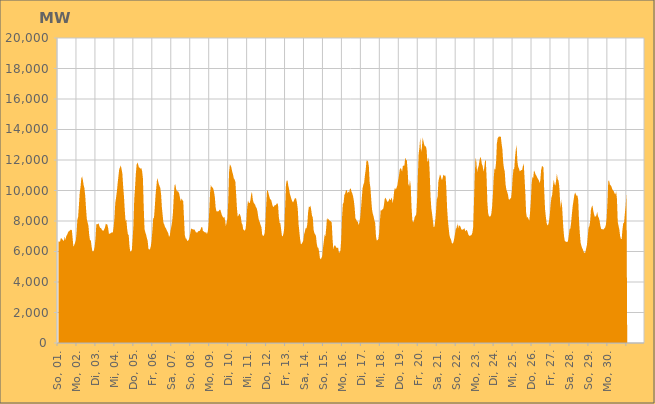
| Category | Series 0 |
|---|---|
|  So, 01.  | 6642.028 |
|  So, 01.  | 6674.191 |
|  So, 01.  | 6621.599 |
|  So, 01.  | 6863.994 |
|  So, 01.  | 6864.676 |
|  So, 01.  | 6793.633 |
|  So, 01.  | 6730.198 |
|  So, 01.  | 6692.56 |
|  So, 01.  | 6982.419 |
|  So, 01.  | 6750.493 |
|  So, 01.  | 7025.823 |
|  So, 01.  | 7081.991 |
|  So, 01.  | 7235.701 |
|  So, 01.  | 7320.651 |
|  So, 01.  | 7346.034 |
|  So, 01.  | 7436.463 |
|  So, 01.  | 7391.824 |
|  Mo, 02.  | 7438.178 |
|  Mo, 02.  | 6881.435 |
|  Mo, 02.  | 6318.565 |
|  Mo, 02.  | 6419.591 |
|  Mo, 02.  | 6559.201 |
|  Mo, 02.  | 6708.7 |
|  Mo, 02.  | 7224.834 |
|  Mo, 02.  | 8080.446 |
|  Mo, 02.  | 8278.272 |
|  Mo, 02.  | 9048.295 |
|  Mo, 02.  | 9866.225 |
|  Mo, 02.  | 10212.87 |
|  Mo, 02.  | 10788.285 |
|  Mo, 02.  | 10922.521 |
|  Mo, 02.  | 10682.266 |
|  Mo, 02.  | 10339.245 |
|  Mo, 02.  | 10139.451 |
|  Mo, 02.  | 9632.16 |
|  Mo, 02.  | 8816.503 |
|  Mo, 02.  | 8119.231 |
|  Mo, 02.  | 7904.268 |
|  Mo, 02.  | 7702.65 |
|  Mo, 02.  | 7088.664 |
|  Mo, 02.  | 6734.831 |
|  Di, 03.  | 6744.243 |
|  Di, 03.  | 6337.28 |
|  Di, 03.  | 6030.206 |
|  Di, 03.  | 5993.294 |
|  Di, 03.  | 6095.118 |
|  Di, 03.  | 6337.548 |
|  Di, 03.  | 6871.834 |
|  Di, 03.  | 7782.233 |
|  Di, 03.  | 7782.221 |
|  Di, 03.  | 7811.911 |
|  Di, 03.  | 7843.748 |
|  Di, 03.  | 7639.849 |
|  Di, 03.  | 7547.561 |
|  Di, 03.  | 7541.524 |
|  Di, 03.  | 7431.637 |
|  Di, 03.  | 7373.073 |
|  Di, 03.  | 7352.578 |
|  Di, 03.  | 7453.121 |
|  Di, 03.  | 7579.167 |
|  Di, 03.  | 7813.836 |
|  Di, 03.  | 7795.705 |
|  Di, 03.  | 7748.932 |
|  Di, 03.  | 7537.983 |
|  Di, 03.  | 7145.782 |
|  Mi, 04.  | 7179.503 |
|  Mi, 04.  | 7193.008 |
|  Mi, 04.  | 7255.267 |
|  Mi, 04.  | 7226.2 |
|  Mi, 04.  | 7283.433 |
|  Mi, 04.  | 7632.698 |
|  Mi, 04.  | 8220.909 |
|  Mi, 04.  | 9187.249 |
|  Mi, 04.  | 9527.014 |
|  Mi, 04.  | 9926.317 |
|  Mi, 04.  | 10467.25 |
|  Mi, 04.  | 10930.109 |
|  Mi, 04.  | 11396.854 |
|  Mi, 04.  | 11509.429 |
|  Mi, 04.  | 11646.825 |
|  Mi, 04.  | 11391.69 |
|  Mi, 04.  | 11098.729 |
|  Mi, 04.  | 10251.658 |
|  Mi, 04.  | 9624.944 |
|  Mi, 04.  | 8709.934 |
|  Mi, 04.  | 7988.747 |
|  Mi, 04.  | 8089.505 |
|  Mi, 04.  | 7493.998 |
|  Mi, 04.  | 7126.262 |
|  Do, 05.  | 7068.576 |
|  Do, 05.  | 6334.545 |
|  Do, 05.  | 5980.791 |
|  Do, 05.  | 6009.791 |
|  Do, 05.  | 6119.631 |
|  Do, 05.  | 6858.394 |
|  Do, 05.  | 7718.454 |
|  Do, 05.  | 9431.919 |
|  Do, 05.  | 10170.524 |
|  Do, 05.  | 11087.446 |
|  Do, 05.  | 11677.397 |
|  Do, 05.  | 11846.221 |
|  Do, 05.  | 11701.938 |
|  Do, 05.  | 11504.531 |
|  Do, 05.  | 11496.591 |
|  Do, 05.  | 11417.237 |
|  Do, 05.  | 11469.203 |
|  Do, 05.  | 11258.321 |
|  Do, 05.  | 10792.783 |
|  Do, 05.  | 8941.93 |
|  Do, 05.  | 7467.128 |
|  Do, 05.  | 7261.39 |
|  Do, 05.  | 7107.223 |
|  Do, 05.  | 6884.12 |
|  Fr, 06.  | 6700.08 |
|  Fr, 06.  | 6165.956 |
|  Fr, 06.  | 6123.522 |
|  Fr, 06.  | 6158.351 |
|  Fr, 06.  | 6351.654 |
|  Fr, 06.  | 6724.755 |
|  Fr, 06.  | 7395.35 |
|  Fr, 06.  | 8162.51 |
|  Fr, 06.  | 8220.292 |
|  Fr, 06.  | 8890.242 |
|  Fr, 06.  | 9718.031 |
|  Fr, 06.  | 10260.719 |
|  Fr, 06.  | 10804.893 |
|  Fr, 06.  | 10663.921 |
|  Fr, 06.  | 10439.058 |
|  Fr, 06.  | 10294.328 |
|  Fr, 06.  | 10161.905 |
|  Fr, 06.  | 9731.773 |
|  Fr, 06.  | 8898.601 |
|  Fr, 06.  | 8365.291 |
|  Fr, 06.  | 7872.196 |
|  Fr, 06.  | 7773.041 |
|  Fr, 06.  | 7602.123 |
|  Fr, 06.  | 7536.495 |
|  Sa, 07.  | 7415.241 |
|  Sa, 07.  | 7312.704 |
|  Sa, 07.  | 7208.53 |
|  Sa, 07.  | 6962.411 |
|  Sa, 07.  | 7035.768 |
|  Sa, 07.  | 7400.317 |
|  Sa, 07.  | 7646.554 |
|  Sa, 07.  | 7967.56 |
|  Sa, 07.  | 8543.211 |
|  Sa, 07.  | 9577.379 |
|  Sa, 07.  | 10330.854 |
|  Sa, 07.  | 10418.47 |
|  Sa, 07.  | 10094.211 |
|  Sa, 07.  | 9954.649 |
|  Sa, 07.  | 9957.218 |
|  Sa, 07.  | 9905.518 |
|  Sa, 07.  | 9772.035 |
|  Sa, 07.  | 9488.952 |
|  Sa, 07.  | 9302.322 |
|  Sa, 07.  | 9481.93 |
|  Sa, 07.  | 9362.161 |
|  Sa, 07.  | 9303.883 |
|  Sa, 07.  | 8175.89 |
|  Sa, 07.  | 7093.512 |
|  So, 08.  | 6864.181 |
|  So, 08.  | 6842.945 |
|  So, 08.  | 6699.577 |
|  So, 08.  | 6702.851 |
|  So, 08.  | 6769.923 |
|  So, 08.  | 6929.743 |
|  So, 08.  | 7227.672 |
|  So, 08.  | 7506.556 |
|  So, 08.  | 7474.205 |
|  So, 08.  | 7458.443 |
|  So, 08.  | 7441.474 |
|  So, 08.  | 7450.766 |
|  So, 08.  | 7375.902 |
|  So, 08.  | 7260.24 |
|  So, 08.  | 7243.029 |
|  So, 08.  | 7250.823 |
|  So, 08.  | 7330.732 |
|  So, 08.  | 7339.213 |
|  So, 08.  | 7360.677 |
|  So, 08.  | 7449.454 |
|  So, 08.  | 7594.554 |
|  So, 08.  | 7612.671 |
|  So, 08.  | 7334.919 |
|  So, 08.  | 7330.46 |
|  Mo, 09.  | 7266.428 |
|  Mo, 09.  | 7245.333 |
|  Mo, 09.  | 7267.27 |
|  Mo, 09.  | 7141.654 |
|  Mo, 09.  | 7300.267 |
|  Mo, 09.  | 7700.536 |
|  Mo, 09.  | 8721.217 |
|  Mo, 09.  | 9877.685 |
|  Mo, 09.  | 10358.566 |
|  Mo, 09.  | 10233.421 |
|  Mo, 09.  | 10205.418 |
|  Mo, 09.  | 10114.91 |
|  Mo, 09.  | 9914.021 |
|  Mo, 09.  | 9582.812 |
|  Mo, 09.  | 8908.356 |
|  Mo, 09.  | 8649.776 |
|  Mo, 09.  | 8616.681 |
|  Mo, 09.  | 8645.019 |
|  Mo, 09.  | 8639.536 |
|  Mo, 09.  | 8743.13 |
|  Mo, 09.  | 8727.543 |
|  Mo, 09.  | 8555.569 |
|  Mo, 09.  | 8381.314 |
|  Mo, 09.  | 8279.195 |
|  Di, 10.  | 8200.304 |
|  Di, 10.  | 8281.948 |
|  Di, 10.  | 8041.037 |
|  Di, 10.  | 7671.665 |
|  Di, 10.  | 7939.606 |
|  Di, 10.  | 8193.565 |
|  Di, 10.  | 9327.738 |
|  Di, 10.  | 11194.328 |
|  Di, 10.  | 11710.8 |
|  Di, 10.  | 11638.89 |
|  Di, 10.  | 11506.158 |
|  Di, 10.  | 11234.667 |
|  Di, 10.  | 11061.029 |
|  Di, 10.  | 10793.392 |
|  Di, 10.  | 10729.62 |
|  Di, 10.  | 10571.757 |
|  Di, 10.  | 9738.798 |
|  Di, 10.  | 8842.908 |
|  Di, 10.  | 8273.188 |
|  Di, 10.  | 8368.486 |
|  Di, 10.  | 8483.91 |
|  Di, 10.  | 8401.909 |
|  Di, 10.  | 8235.313 |
|  Di, 10.  | 7852.467 |
|  Mi, 11.  | 7766.42 |
|  Mi, 11.  | 7421.337 |
|  Mi, 11.  | 7421.193 |
|  Mi, 11.  | 7348.405 |
|  Mi, 11.  | 7501.968 |
|  Mi, 11.  | 8018.551 |
|  Mi, 11.  | 8898.239 |
|  Mi, 11.  | 9344.431 |
|  Mi, 11.  | 9201.671 |
|  Mi, 11.  | 9166.015 |
|  Mi, 11.  | 9352.832 |
|  Mi, 11.  | 9741.743 |
|  Mi, 11.  | 9912.165 |
|  Mi, 11.  | 9437.332 |
|  Mi, 11.  | 9216.602 |
|  Mi, 11.  | 9141.28 |
|  Mi, 11.  | 9059.923 |
|  Mi, 11.  | 8920.554 |
|  Mi, 11.  | 8841.736 |
|  Mi, 11.  | 8626.947 |
|  Mi, 11.  | 8258.347 |
|  Mi, 11.  | 8021.187 |
|  Mi, 11.  | 7902.076 |
|  Mi, 11.  | 7726.217 |
|  Do, 12.  | 7591.44 |
|  Do, 12.  | 7096.047 |
|  Do, 12.  | 7025.294 |
|  Do, 12.  | 7039.295 |
|  Do, 12.  | 7198.728 |
|  Do, 12.  | 7803.384 |
|  Do, 12.  | 9003.936 |
|  Do, 12.  | 9979.837 |
|  Do, 12.  | 10027.529 |
|  Do, 12.  | 9807.652 |
|  Do, 12.  | 9604.019 |
|  Do, 12.  | 9413.516 |
|  Do, 12.  | 9425.879 |
|  Do, 12.  | 9248.547 |
|  Do, 12.  | 9015.605 |
|  Do, 12.  | 8905.136 |
|  Do, 12.  | 8960.807 |
|  Do, 12.  | 9048.98 |
|  Do, 12.  | 9035.233 |
|  Do, 12.  | 9106.952 |
|  Do, 12.  | 9177.631 |
|  Do, 12.  | 9065.568 |
|  Do, 12.  | 8279.227 |
|  Do, 12.  | 7890.987 |
|  Fr, 13.  | 7844.61 |
|  Fr, 13.  | 7426.827 |
|  Fr, 13.  | 7016.919 |
|  Fr, 13.  | 6996.445 |
|  Fr, 13.  | 7214.384 |
|  Fr, 13.  | 7581.318 |
|  Fr, 13.  | 8896.723 |
|  Fr, 13.  | 10372.421 |
|  Fr, 13.  | 10653.682 |
|  Fr, 13.  | 10660.58 |
|  Fr, 13.  | 10323.913 |
|  Fr, 13.  | 10087.118 |
|  Fr, 13.  | 9780.072 |
|  Fr, 13.  | 9609.019 |
|  Fr, 13.  | 9427.835 |
|  Fr, 13.  | 9295.118 |
|  Fr, 13.  | 9212.424 |
|  Fr, 13.  | 9315.276 |
|  Fr, 13.  | 9459.097 |
|  Fr, 13.  | 9507.518 |
|  Fr, 13.  | 9454.954 |
|  Fr, 13.  | 9194.047 |
|  Fr, 13.  | 8786.82 |
|  Fr, 13.  | 7795.777 |
|  Sa, 14.  | 7293.207 |
|  Sa, 14.  | 6796.023 |
|  Sa, 14.  | 6471.076 |
|  Sa, 14.  | 6505.74 |
|  Sa, 14.  | 6609.398 |
|  Sa, 14.  | 6707.56 |
|  Sa, 14.  | 7117.978 |
|  Sa, 14.  | 7319.401 |
|  Sa, 14.  | 7538.036 |
|  Sa, 14.  | 7515.722 |
|  Sa, 14.  | 7754.207 |
|  Sa, 14.  | 8531.126 |
|  Sa, 14.  | 8932.662 |
|  Sa, 14.  | 8915.36 |
|  Sa, 14.  | 9009.305 |
|  Sa, 14.  | 8733.377 |
|  Sa, 14.  | 8345.675 |
|  Sa, 14.  | 8247.516 |
|  Sa, 14.  | 7435.509 |
|  Sa, 14.  | 7211.661 |
|  Sa, 14.  | 7122.798 |
|  Sa, 14.  | 7029.25 |
|  Sa, 14.  | 6524.892 |
|  Sa, 14.  | 6267.563 |
|  So, 15.  | 6241.243 |
|  So, 15.  | 6003.181 |
|  So, 15.  | 5581.366 |
|  So, 15.  | 5491.371 |
|  So, 15.  | 5576.23 |
|  So, 15.  | 5713.86 |
|  So, 15.  | 6275.852 |
|  So, 15.  | 6686.518 |
|  So, 15.  | 7099.546 |
|  So, 15.  | 7002.897 |
|  So, 15.  | 7558.152 |
|  So, 15.  | 8222.084 |
|  So, 15.  | 8075.066 |
|  So, 15.  | 8131.449 |
|  So, 15.  | 8034.185 |
|  So, 15.  | 8003.793 |
|  So, 15.  | 7972.141 |
|  So, 15.  | 7885.68 |
|  So, 15.  | 6840.44 |
|  So, 15.  | 6149.071 |
|  So, 15.  | 6335.135 |
|  So, 15.  | 6422.615 |
|  So, 15.  | 6335.067 |
|  So, 15.  | 6244.289 |
|  Mo, 16.  | 6228.563 |
|  Mo, 16.  | 6262.632 |
|  Mo, 16.  | 5953.953 |
|  Mo, 16.  | 5928.931 |
|  Mo, 16.  | 6082.505 |
|  Mo, 16.  | 6794.305 |
|  Mo, 16.  | 8191.95 |
|  Mo, 16.  | 9103.88 |
|  Mo, 16.  | 9206.6 |
|  Mo, 16.  | 9712.1 |
|  Mo, 16.  | 9803.879 |
|  Mo, 16.  | 10016.723 |
|  Mo, 16.  | 10027.529 |
|  Mo, 16.  | 9814.001 |
|  Mo, 16.  | 9941.905 |
|  Mo, 16.  | 9851.562 |
|  Mo, 16.  | 10106.8 |
|  Mo, 16.  | 10137.713 |
|  Mo, 16.  | 9924.292 |
|  Mo, 16.  | 9805.95 |
|  Mo, 16.  | 9616.469 |
|  Mo, 16.  | 9327.453 |
|  Mo, 16.  | 8858.004 |
|  Mo, 16.  | 8157.351 |
|  Di, 17.  | 8100.026 |
|  Di, 17.  | 7949 |
|  Di, 17.  | 7972.361 |
|  Di, 17.  | 7732.363 |
|  Di, 17.  | 7914.044 |
|  Di, 17.  | 8209.041 |
|  Di, 17.  | 8792.246 |
|  Di, 17.  | 9506.215 |
|  Di, 17.  | 10138.157 |
|  Di, 17.  | 10368.749 |
|  Di, 17.  | 10520.384 |
|  Di, 17.  | 11007.634 |
|  Di, 17.  | 11379.679 |
|  Di, 17.  | 11960.433 |
|  Di, 17.  | 11970.689 |
|  Di, 17.  | 11902.157 |
|  Di, 17.  | 11558.016 |
|  Di, 17.  | 10522.627 |
|  Di, 17.  | 10160.79 |
|  Di, 17.  | 9400.066 |
|  Di, 17.  | 8746.826 |
|  Di, 17.  | 8460.965 |
|  Di, 17.  | 8303.585 |
|  Di, 17.  | 8039.091 |
|  Mi, 18.  | 7869.372 |
|  Mi, 18.  | 6983.194 |
|  Mi, 18.  | 6723.488 |
|  Mi, 18.  | 6743.188 |
|  Mi, 18.  | 6817.25 |
|  Mi, 18.  | 7210.692 |
|  Mi, 18.  | 8009.206 |
|  Mi, 18.  | 8751.519 |
|  Mi, 18.  | 8674.987 |
|  Mi, 18.  | 8765.319 |
|  Mi, 18.  | 8771.302 |
|  Mi, 18.  | 9023.143 |
|  Mi, 18.  | 9432.534 |
|  Mi, 18.  | 9536.784 |
|  Mi, 18.  | 9422.49 |
|  Mi, 18.  | 9296.919 |
|  Mi, 18.  | 9246.905 |
|  Mi, 18.  | 9317.866 |
|  Mi, 18.  | 9485.233 |
|  Mi, 18.  | 9365.092 |
|  Mi, 18.  | 9421.101 |
|  Mi, 18.  | 9551.895 |
|  Mi, 18.  | 9171.432 |
|  Mi, 18.  | 9444.374 |
|  Do, 19.  | 9963.313 |
|  Do, 19.  | 10184.429 |
|  Do, 19.  | 10068.939 |
|  Do, 19.  | 10176.169 |
|  Do, 19.  | 10323.861 |
|  Do, 19.  | 10666.327 |
|  Do, 19.  | 10950.685 |
|  Do, 19.  | 11359.88 |
|  Do, 19.  | 11468.677 |
|  Do, 19.  | 11414.288 |
|  Do, 19.  | 11233.363 |
|  Do, 19.  | 11600.651 |
|  Do, 19.  | 11633.936 |
|  Do, 19.  | 11648.113 |
|  Do, 19.  | 12170.756 |
|  Do, 19.  | 11997.227 |
|  Do, 19.  | 12006.1 |
|  Do, 19.  | 11350.8 |
|  Do, 19.  | 10418.551 |
|  Do, 19.  | 10278.224 |
|  Do, 19.  | 10701.254 |
|  Do, 19.  | 10256.119 |
|  Do, 19.  | 8897.827 |
|  Do, 19.  | 8056.083 |
|  Fr, 20.  | 7910.84 |
|  Fr, 20.  | 8011.032 |
|  Fr, 20.  | 8267.492 |
|  Fr, 20.  | 8337.287 |
|  Fr, 20.  | 8441.893 |
|  Fr, 20.  | 9376.265 |
|  Fr, 20.  | 10982.621 |
|  Fr, 20.  | 12412.661 |
|  Fr, 20.  | 12829.883 |
|  Fr, 20.  | 13496.02 |
|  Fr, 20.  | 12525.395 |
|  Fr, 20.  | 12766.728 |
|  Fr, 20.  | 13459.337 |
|  Fr, 20.  | 13251.644 |
|  Fr, 20.  | 13008.269 |
|  Fr, 20.  | 12887.798 |
|  Fr, 20.  | 12905.293 |
|  Fr, 20.  | 12716.429 |
|  Fr, 20.  | 11902.779 |
|  Fr, 20.  | 11930.097 |
|  Fr, 20.  | 12166.224 |
|  Fr, 20.  | 11131.002 |
|  Fr, 20.  | 9647.032 |
|  Fr, 20.  | 8848.942 |
|  Sa, 21.  | 8472.53 |
|  Sa, 21.  | 8052.206 |
|  Sa, 21.  | 7608.154 |
|  Sa, 21.  | 7619.536 |
|  Sa, 21.  | 8019.318 |
|  Sa, 21.  | 8629.725 |
|  Sa, 21.  | 9418.151 |
|  Sa, 21.  | 9585.53 |
|  Sa, 21.  | 10594.388 |
|  Sa, 21.  | 10843.048 |
|  Sa, 21.  | 11057.198 |
|  Sa, 21.  | 10958.18 |
|  Sa, 21.  | 10725.544 |
|  Sa, 21.  | 10727.581 |
|  Sa, 21.  | 10975.887 |
|  Sa, 21.  | 11044.195 |
|  Sa, 21.  | 10946.644 |
|  Sa, 21.  | 10981.686 |
|  Sa, 21.  | 10168.744 |
|  Sa, 21.  | 8858.795 |
|  Sa, 21.  | 8068.649 |
|  Sa, 21.  | 7546.902 |
|  Sa, 21.  | 7062.117 |
|  Sa, 21.  | 6878.652 |
|  So, 22.  | 6780.996 |
|  So, 22.  | 6554.976 |
|  So, 22.  | 6517.769 |
|  So, 22.  | 6602.522 |
|  So, 22.  | 6841.575 |
|  So, 22.  | 7137.392 |
|  So, 22.  | 7475.986 |
|  So, 22.  | 7544.462 |
|  So, 22.  | 7848.286 |
|  So, 22.  | 7518.025 |
|  So, 22.  | 7719.886 |
|  So, 22.  | 7682.398 |
|  So, 22.  | 7626.872 |
|  So, 22.  | 7441.065 |
|  So, 22.  | 7442.063 |
|  So, 22.  | 7427.112 |
|  So, 22.  | 7478.584 |
|  So, 22.  | 7524.192 |
|  So, 22.  | 7319.279 |
|  So, 22.  | 7388.146 |
|  So, 22.  | 7414.67 |
|  So, 22.  | 7276.448 |
|  So, 22.  | 7097.227 |
|  So, 22.  | 7033.602 |
|  Mo, 23.  | 7037.877 |
|  Mo, 23.  | 7056.808 |
|  Mo, 23.  | 7089.367 |
|  Mo, 23.  | 7235.904 |
|  Mo, 23.  | 7583.294 |
|  Mo, 23.  | 9165.336 |
|  Mo, 23.  | 10923.188 |
|  Mo, 23.  | 12163.193 |
|  Mo, 23.  | 11897.617 |
|  Mo, 23.  | 11229.645 |
|  Mo, 23.  | 11470.255 |
|  Mo, 23.  | 11617.939 |
|  Mo, 23.  | 11955.354 |
|  Mo, 23.  | 12207.846 |
|  Mo, 23.  | 12083.521 |
|  Mo, 23.  | 11732.718 |
|  Mo, 23.  | 11618.82 |
|  Mo, 23.  | 11241.106 |
|  Mo, 23.  | 11479.41 |
|  Mo, 23.  | 11933.034 |
|  Mo, 23.  | 12015.914 |
|  Mo, 23.  | 10862.695 |
|  Mo, 23.  | 9190.82 |
|  Mo, 23.  | 8501.877 |
|  Di, 24.  | 8311.022 |
|  Di, 24.  | 8288.758 |
|  Di, 24.  | 8313.728 |
|  Di, 24.  | 8474.898 |
|  Di, 24.  | 8947.361 |
|  Di, 24.  | 9756.104 |
|  Di, 24.  | 10796.678 |
|  Di, 24.  | 11456.494 |
|  Di, 24.  | 11366.267 |
|  Di, 24.  | 11834.859 |
|  Di, 24.  | 13068.759 |
|  Di, 24.  | 13418.089 |
|  Di, 24.  | 13505.215 |
|  Di, 24.  | 13553.445 |
|  Di, 24.  | 13523.637 |
|  Di, 24.  | 13541.016 |
|  Di, 24.  | 13055.978 |
|  Di, 24.  | 12691.011 |
|  Di, 24.  | 11852.798 |
|  Di, 24.  | 11450.289 |
|  Di, 24.  | 11236.877 |
|  Di, 24.  | 10412.058 |
|  Di, 24.  | 10069.215 |
|  Di, 24.  | 9911.534 |
|  Mi, 25.  | 9749.941 |
|  Mi, 25.  | 9426.458 |
|  Mi, 25.  | 9399.017 |
|  Mi, 25.  | 9470.15 |
|  Mi, 25.  | 9518.466 |
|  Mi, 25.  | 9998.19 |
|  Mi, 25.  | 10884.788 |
|  Mi, 25.  | 11405.037 |
|  Mi, 25.  | 11427.913 |
|  Mi, 25.  | 12166.381 |
|  Mi, 25.  | 12691.77 |
|  Mi, 25.  | 12958.205 |
|  Mi, 25.  | 11892.669 |
|  Mi, 25.  | 11555.409 |
|  Mi, 25.  | 11435.787 |
|  Mi, 25.  | 11247.769 |
|  Mi, 25.  | 11302.972 |
|  Mi, 25.  | 11340.708 |
|  Mi, 25.  | 11342.661 |
|  Mi, 25.  | 11608.363 |
|  Mi, 25.  | 11779.16 |
|  Mi, 25.  | 10851.134 |
|  Mi, 25.  | 9873.873 |
|  Mi, 25.  | 8564.87 |
|  Do, 26.  | 8231.443 |
|  Do, 26.  | 8267.812 |
|  Do, 26.  | 8134.744 |
|  Do, 26.  | 8017.538 |
|  Do, 26.  | 8546.039 |
|  Do, 26.  | 9302.214 |
|  Do, 26.  | 10428.263 |
|  Do, 26.  | 10897.353 |
|  Do, 26.  | 10803.097 |
|  Do, 26.  | 11317.217 |
|  Do, 26.  | 11211.64 |
|  Do, 26.  | 11047.732 |
|  Do, 26.  | 10972.835 |
|  Do, 26.  | 10854.276 |
|  Do, 26.  | 10759.555 |
|  Do, 26.  | 10681.556 |
|  Do, 26.  | 10491.108 |
|  Do, 26.  | 10667.431 |
|  Do, 26.  | 11331.424 |
|  Do, 26.  | 11580.616 |
|  Do, 26.  | 11592.847 |
|  Do, 26.  | 11501.686 |
|  Do, 26.  | 9908.443 |
|  Do, 26.  | 8766.101 |
|  Fr, 27.  | 8281.461 |
|  Fr, 27.  | 7864.098 |
|  Fr, 27.  | 7706.321 |
|  Fr, 27.  | 7752.197 |
|  Fr, 27.  | 7984.73 |
|  Fr, 27.  | 8399.254 |
|  Fr, 27.  | 9075.11 |
|  Fr, 27.  | 9523.814 |
|  Fr, 27.  | 9709.199 |
|  Fr, 27.  | 10295.498 |
|  Fr, 27.  | 10712.118 |
|  Fr, 27.  | 10412.6 |
|  Fr, 27.  | 10324.996 |
|  Fr, 27.  | 10662.112 |
|  Fr, 27.  | 11105.111 |
|  Fr, 27.  | 10739.879 |
|  Fr, 27.  | 10656.667 |
|  Fr, 27.  | 10287.328 |
|  Fr, 27.  | 9323.659 |
|  Fr, 27.  | 8877.195 |
|  Fr, 27.  | 9410.041 |
|  Fr, 27.  | 8568.946 |
|  Fr, 27.  | 7649.768 |
|  Fr, 27.  | 7016.506 |
|  Sa, 28.  | 6687.891 |
|  Sa, 28.  | 6653.792 |
|  Sa, 28.  | 6635.935 |
|  Sa, 28.  | 6618.603 |
|  Sa, 28.  | 6679.647 |
|  Sa, 28.  | 7016.367 |
|  Sa, 28.  | 7469.676 |
|  Sa, 28.  | 7508.706 |
|  Sa, 28.  | 7899.181 |
|  Sa, 28.  | 8476.789 |
|  Sa, 28.  | 8991.204 |
|  Sa, 28.  | 9330.144 |
|  Sa, 28.  | 9678.286 |
|  Sa, 28.  | 9875.358 |
|  Sa, 28.  | 9756.288 |
|  Sa, 28.  | 9646.636 |
|  Sa, 28.  | 9674.474 |
|  Sa, 28.  | 9367.734 |
|  Sa, 28.  | 8008.479 |
|  Sa, 28.  | 7193.476 |
|  Sa, 28.  | 6578.429 |
|  Sa, 28.  | 6366.391 |
|  Sa, 28.  | 6224.859 |
|  Sa, 28.  | 6109.757 |
|  So, 29.  | 5951.564 |
|  So, 29.  | 5912.203 |
|  So, 29.  | 5935.625 |
|  So, 29.  | 6199.504 |
|  So, 29.  | 6429.233 |
|  So, 29.  | 6937.98 |
|  So, 29.  | 7556.121 |
|  So, 29.  | 7637.741 |
|  So, 29.  | 7960.229 |
|  So, 29.  | 8703.183 |
|  So, 29.  | 8932.672 |
|  So, 29.  | 9026.398 |
|  So, 29.  | 8680.919 |
|  So, 29.  | 8441.276 |
|  So, 29.  | 8271.83 |
|  So, 29.  | 8300.307 |
|  So, 29.  | 8378.884 |
|  So, 29.  | 8605.71 |
|  So, 29.  | 8314.272 |
|  So, 29.  | 8215.689 |
|  So, 29.  | 8015.396 |
|  So, 29.  | 7689.279 |
|  So, 29.  | 7478.515 |
|  So, 29.  | 7460.515 |
|  Mo, 30.  | 7455.649 |
|  Mo, 30.  | 7444.476 |
|  Mo, 30.  | 7516.061 |
|  Mo, 30.  | 7571.286 |
|  Mo, 30.  | 7755.448 |
|  Mo, 30.  | 8195.461 |
|  Mo, 30.  | 9249.215 |
|  Mo, 30.  | 10599.919 |
|  Mo, 30.  | 10667.849 |
|  Mo, 30.  | 10395.351 |
|  Mo, 30.  | 10339.166 |
|  Mo, 30.  | 10262.741 |
|  Mo, 30.  | 10103.744 |
|  Mo, 30.  | 10015.476 |
|  Mo, 30.  | 9952.994 |
|  Mo, 30.  | 9810.006 |
|  Mo, 30.  | 9742.815 |
|  Mo, 30.  | 9938.301 |
|  Mo, 30.  | 9439.927 |
|  Mo, 30.  | 7951.87 |
|  Mo, 30.  | 7676.997 |
|  Mo, 30.  | 7452.214 |
|  Mo, 30.  | 7012.418 |
|  Mo, 30.  | 6825.688 |
|  Di, 01.  | 6827.048 |
|  Di, 01.  | 7452.268 |
|  Di, 01.  | 7857.461 |
|  Di, 01.  | 7884.922 |
|  Di, 01.  | 8480.477 |
|  Di, 01.  | 8982.462 |
|    | 9767.248 |
|    | 0 |
|    | 0 |
|    | 0 |
|    | 0 |
|    | 0 |
|    | 0 |
|    | 0 |
|    | 0 |
|    | 0 |
|    | 0 |
|    | 0 |
|    | 0 |
|    | 0 |
|    | 0 |
|    | 0 |
|    | 0 |
|    | 0 |
|    | 0 |
|    | 0 |
|    | 0 |
|    | 0 |
|    | 0 |
|    | 0 |